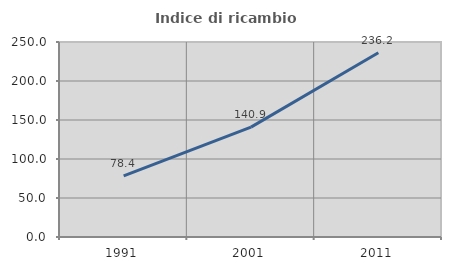
| Category | Indice di ricambio occupazionale  |
|---|---|
| 1991.0 | 78.415 |
| 2001.0 | 140.893 |
| 2011.0 | 236.213 |